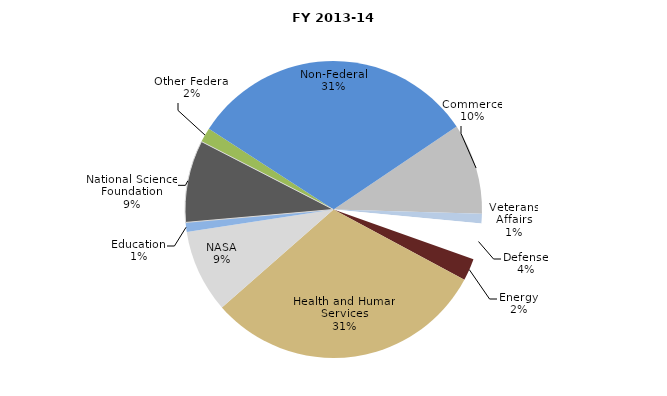
| Category | Series 0 |
|---|---|
| Commerce | 85355681 |
| Veterans Affairs | 9122741 |
| Defense | 33883565 |
| Energy | 20883790 |
| Health and Human Services | 264967101 |
| NASA | 78016721 |
| Education | 8980311 |
| National Science Foundation | 77256644 |
| Other Federal | 13716718 |
| Non-Federal | 271120893 |